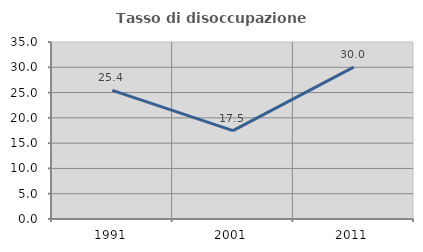
| Category | Tasso di disoccupazione giovanile  |
|---|---|
| 1991.0 | 25.442 |
| 2001.0 | 17.489 |
| 2011.0 | 30.033 |